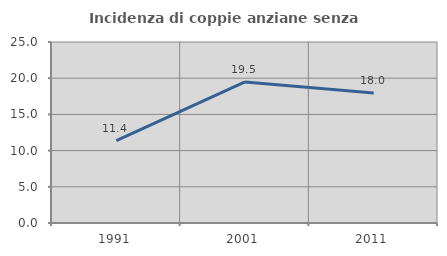
| Category | Incidenza di coppie anziane senza figli  |
|---|---|
| 1991.0 | 11.386 |
| 2001.0 | 19.487 |
| 2011.0 | 17.964 |